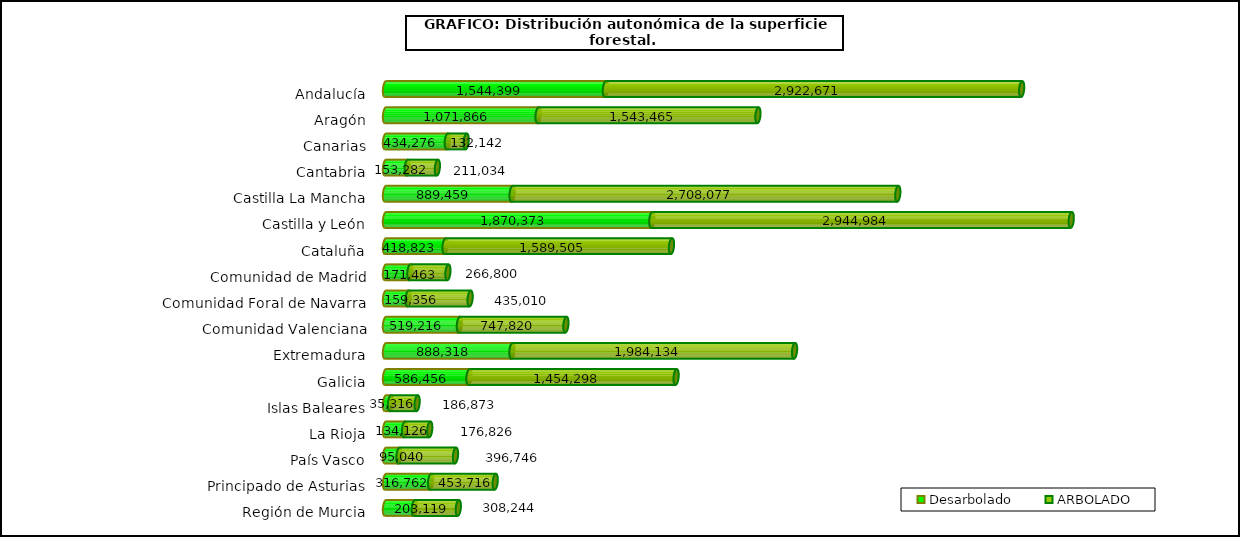
| Category | Desarbolado | ARBOLADO |
|---|---|---|
| Andalucía | 1544399.441 | 2922670.688 |
| Aragón | 1071866.444 | 1543465.178 |
| Canarias | 434275.866 | 132141.953 |
| Cantabria | 153282.495 | 211034.493 |
| Castilla La Mancha | 889459.194 | 2708077.314 |
| Castilla y León | 1870372.822 | 2944983.923 |
| Cataluña | 418823.203 | 1589505.325 |
| Comunidad de Madrid | 171462.672 | 266799.661 |
| Comunidad Foral de Navarra | 159356.479 | 435009.778 |
| Comunidad Valenciana | 519215.632 | 747820.478 |
| Extremadura | 888317.514 | 1984133.695 |
| Galicia | 586456.281 | 1454297.761 |
| Islas Baleares | 35315.826 | 186872.539 |
| La Rioja | 134126.249 | 176826.022 |
| País Vasco | 95040.215 | 396745.855 |
| Principado de Asturias | 316762.429 | 453716.341 |
| Región de Murcia | 203119.381 | 308244.333 |